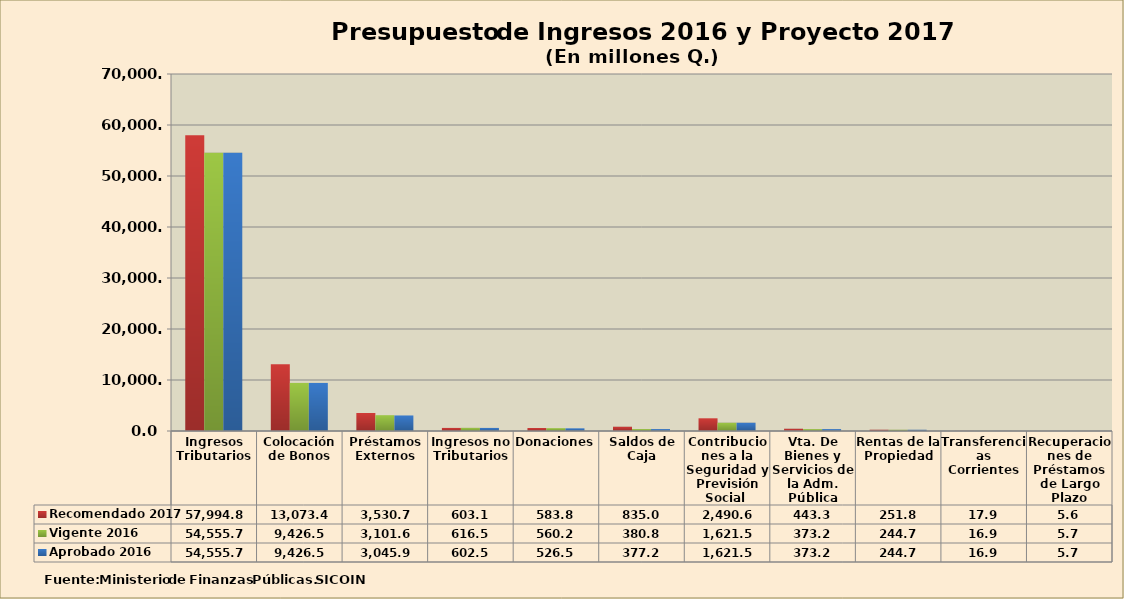
| Category | Recomendado 2017 | Vigente 2016 | Aprobado 2016 |
|---|---|---|---|
| Ingresos Tributarios | 57994.8 | 54555.7 | 54555.7 |
| Colocación de Bonos | 13073.4 | 9426.5 | 9426.5 |
| Préstamos Externos | 3530.7 | 3101.6 | 3045.9 |
| Ingresos no Tributarios | 603.1 | 616.5 | 602.5 |
| Donaciones | 583.8 | 560.2 | 526.5 |
| Saldos de Caja | 835 | 380.8 | 377.2 |
| Contribuciones a la Seguridad y Previsión Social  | 2490.6 | 1621.5 | 1621.5 |
| Vta. De Bienes y Servicios de la Adm. Pública | 443.3 | 373.2 | 373.2 |
| Rentas de la Propiedad | 251.8 | 244.7 | 244.7 |
| Transferencias Corrientes | 17.9 | 16.9 | 16.9 |
| Recuperaciones de Préstamos de Largo Plazo | 5.6 | 5.7 | 5.7 |